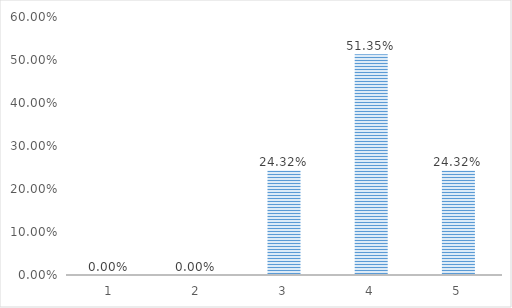
| Category | Series 0 |
|---|---|
| 1.0 | 0 |
| 2.0 | 0 |
| 3.0 | 0.243 |
| 4.0 | 0.514 |
| 5.0 | 0.243 |